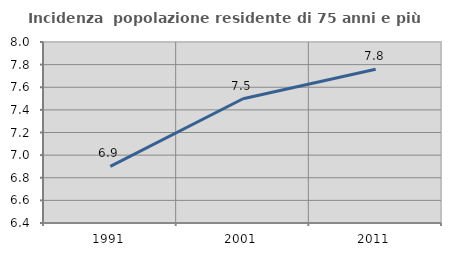
| Category | Incidenza  popolazione residente di 75 anni e più |
|---|---|
| 1991.0 | 6.901 |
| 2001.0 | 7.499 |
| 2011.0 | 7.759 |